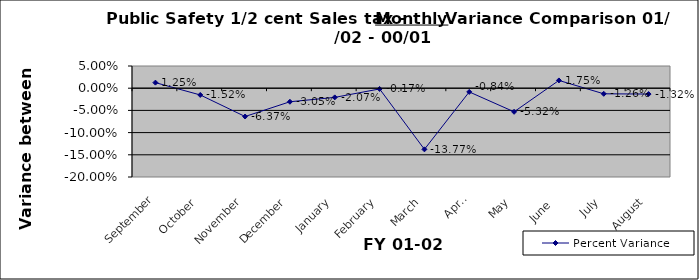
| Category | Percent Variance |
|---|---|
| September | 0.013 |
| October | -0.015 |
| November | -0.064 |
| December | -0.031 |
| January | -0.021 |
| February | -0.002 |
| March | -0.138 |
| April | -0.008 |
| May | -0.053 |
| June  | 0.018 |
| July | -0.013 |
| August | -0.013 |